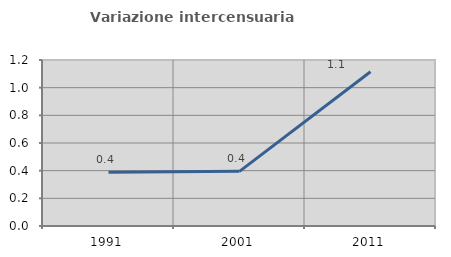
| Category | Variazione intercensuaria annua |
|---|---|
| 1991.0 | 0.388 |
| 2001.0 | 0.395 |
| 2011.0 | 1.115 |